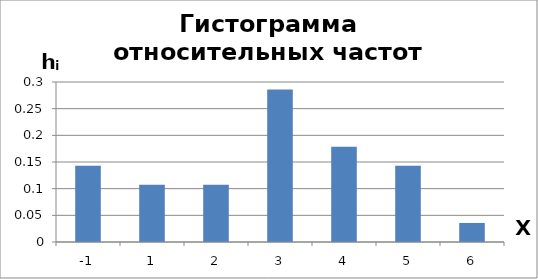
| Category | Series 0 |
|---|---|
| -1.0 | 0.143 |
| 1.0 | 0.107 |
| 2.0 | 0.107 |
| 3.0 | 0.286 |
| 4.0 | 0.179 |
| 5.0 | 0.143 |
| 6.0 | 0.036 |